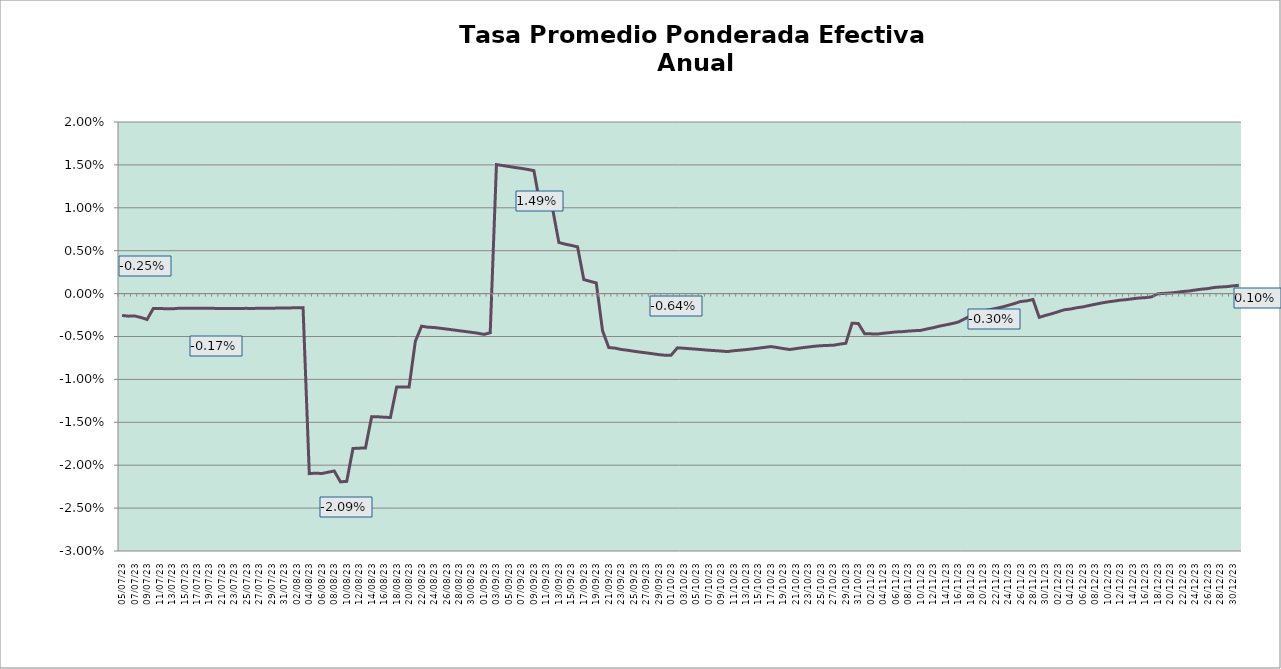
| Category | TEA |
|---|---|
| 2023-07-05 | -0.003 |
| 2023-07-06 | -0.003 |
| 2023-07-07 | -0.003 |
| 2023-07-08 | -0.003 |
| 2023-07-09 | -0.003 |
| 2023-07-10 | -0.002 |
| 2023-07-11 | -0.002 |
| 2023-07-12 | -0.002 |
| 2023-07-13 | -0.002 |
| 2023-07-14 | -0.002 |
| 2023-07-15 | -0.002 |
| 2023-07-16 | -0.002 |
| 2023-07-17 | -0.002 |
| 2023-07-18 | -0.002 |
| 2023-07-19 | -0.002 |
| 2023-07-20 | -0.002 |
| 2023-07-21 | -0.002 |
| 2023-07-22 | -0.002 |
| 2023-07-23 | -0.002 |
| 2023-07-24 | -0.002 |
| 2023-07-25 | -0.002 |
| 2023-07-26 | -0.002 |
| 2023-07-27 | -0.002 |
| 2023-07-28 | -0.002 |
| 2023-07-29 | -0.002 |
| 2023-07-30 | -0.002 |
| 2023-07-31 | -0.002 |
| 2023-08-01 | -0.002 |
| 2023-08-02 | -0.002 |
| 2023-08-03 | -0.002 |
| 2023-08-04 | -0.021 |
| 2023-08-05 | -0.021 |
| 2023-08-06 | -0.021 |
| 2023-08-07 | -0.021 |
| 2023-08-08 | -0.021 |
| 2023-08-09 | -0.022 |
| 2023-08-10 | -0.022 |
| 2023-08-11 | -0.018 |
| 2023-08-12 | -0.018 |
| 2023-08-13 | -0.018 |
| 2023-08-14 | -0.014 |
| 2023-08-15 | -0.014 |
| 2023-08-16 | -0.014 |
| 2023-08-17 | -0.014 |
| 2023-08-18 | -0.011 |
| 2023-08-19 | -0.011 |
| 2023-08-20 | -0.011 |
| 2023-08-21 | -0.006 |
| 2023-08-22 | -0.004 |
| 2023-08-23 | -0.004 |
| 2023-08-24 | -0.004 |
| 2023-08-25 | -0.004 |
| 2023-08-26 | -0.004 |
| 2023-08-27 | -0.004 |
| 2023-08-28 | -0.004 |
| 2023-08-29 | -0.004 |
| 2023-08-30 | -0.005 |
| 2023-08-31 | -0.005 |
| 2023-09-01 | -0.005 |
| 2023-09-02 | -0.005 |
| 2023-09-03 | 0.015 |
| 2023-09-04 | 0.015 |
| 2023-09-05 | 0.015 |
| 2023-09-06 | 0.015 |
| 2023-09-07 | 0.015 |
| 2023-09-08 | 0.014 |
| 2023-09-09 | 0.014 |
| 2023-09-10 | 0.01 |
| 2023-09-11 | 0.01 |
| 2023-09-12 | 0.01 |
| 2023-09-13 | 0.006 |
| 2023-09-14 | 0.006 |
| 2023-09-15 | 0.006 |
| 2023-09-16 | 0.005 |
| 2023-09-17 | 0.002 |
| 2023-09-18 | 0.001 |
| 2023-09-19 | 0.001 |
| 2023-09-20 | -0.004 |
| 2023-09-21 | -0.006 |
| 2023-09-22 | -0.006 |
| 2023-09-23 | -0.007 |
| 2023-09-24 | -0.007 |
| 2023-09-25 | -0.007 |
| 2023-09-26 | -0.007 |
| 2023-09-27 | -0.007 |
| 2023-09-28 | -0.007 |
| 2023-09-29 | -0.007 |
| 2023-09-30 | -0.007 |
| 2023-10-01 | -0.007 |
| 2023-10-02 | -0.006 |
| 2023-10-03 | -0.006 |
| 2023-10-04 | -0.006 |
| 2023-10-05 | -0.006 |
| 2023-10-06 | -0.007 |
| 2023-10-07 | -0.007 |
| 2023-10-08 | -0.007 |
| 2023-10-09 | -0.007 |
| 2023-10-10 | -0.007 |
| 2023-10-11 | -0.007 |
| 2023-10-12 | -0.007 |
| 2023-10-13 | -0.007 |
| 2023-10-14 | -0.006 |
| 2023-10-15 | -0.006 |
| 2023-10-16 | -0.006 |
| 2023-10-17 | -0.006 |
| 2023-10-18 | -0.006 |
| 2023-10-19 | -0.006 |
| 2023-10-20 | -0.007 |
| 2023-10-21 | -0.006 |
| 2023-10-22 | -0.006 |
| 2023-10-23 | -0.006 |
| 2023-10-24 | -0.006 |
| 2023-10-25 | -0.006 |
| 2023-10-26 | -0.006 |
| 2023-10-27 | -0.006 |
| 2023-10-28 | -0.006 |
| 2023-10-29 | -0.006 |
| 2023-10-30 | -0.003 |
| 2023-10-31 | -0.003 |
| 2023-11-01 | -0.005 |
| 2023-11-02 | -0.005 |
| 2023-11-03 | -0.005 |
| 2023-11-04 | -0.005 |
| 2023-11-05 | -0.005 |
| 2023-11-06 | -0.004 |
| 2023-11-07 | -0.004 |
| 2023-11-08 | -0.004 |
| 2023-11-09 | -0.004 |
| 2023-11-10 | -0.004 |
| 2023-11-11 | -0.004 |
| 2023-11-12 | -0.004 |
| 2023-11-13 | -0.004 |
| 2023-11-14 | -0.004 |
| 2023-11-15 | -0.004 |
| 2023-11-16 | -0.003 |
| 2023-11-17 | -0.003 |
| 2023-11-18 | -0.003 |
| 2023-11-19 | -0.002 |
| 2023-11-20 | -0.002 |
| 2023-11-21 | -0.002 |
| 2023-11-22 | -0.002 |
| 2023-11-23 | -0.002 |
| 2023-11-24 | -0.001 |
| 2023-11-25 | -0.001 |
| 2023-11-26 | -0.001 |
| 2023-11-27 | -0.001 |
| 2023-11-28 | -0.001 |
| 2023-11-29 | -0.003 |
| 2023-11-30 | -0.003 |
| 2023-12-01 | -0.002 |
| 2023-12-02 | -0.002 |
| 2023-12-03 | -0.002 |
| 2023-12-04 | -0.002 |
| 2023-12-05 | -0.002 |
| 2023-12-06 | -0.002 |
| 2023-12-07 | -0.001 |
| 2023-12-08 | -0.001 |
| 2023-12-09 | -0.001 |
| 2023-12-10 | -0.001 |
| 2023-12-11 | -0.001 |
| 2023-12-12 | -0.001 |
| 2023-12-13 | -0.001 |
| 2023-12-14 | -0.001 |
| 2023-12-15 | -0.001 |
| 2023-12-16 | 0 |
| 2023-12-17 | 0 |
| 2023-12-18 | 0 |
| 2023-12-19 | 0 |
| 2023-12-20 | 0 |
| 2023-12-21 | 0 |
| 2023-12-22 | 0 |
| 2023-12-23 | 0 |
| 2023-12-24 | 0 |
| 2023-12-25 | 0.001 |
| 2023-12-26 | 0.001 |
| 2023-12-27 | 0.001 |
| 2023-12-28 | 0.001 |
| 2023-12-29 | 0.001 |
| 2023-12-30 | 0.001 |
| 2023-12-31 | 0.001 |